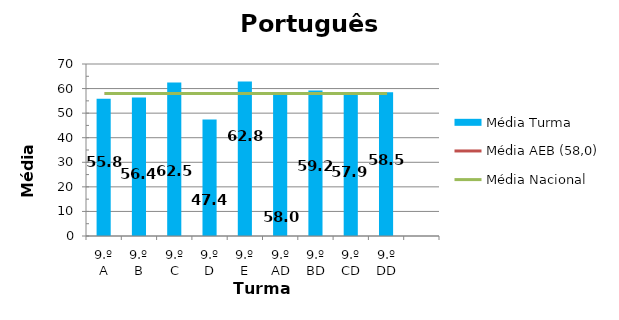
| Category | Média Turma |
|---|---|
| 9.º A | 55.83 |
| 9.º B | 56.39 |
| 9.º C | 62.46 |
| 9.º D | 47.44 |
| 9.º E | 62.83 |
| 9.º AD | 58 |
| 9.º BD | 59.24 |
| 9.º CD | 57.88 |
| 9.º DD | 58.5 |